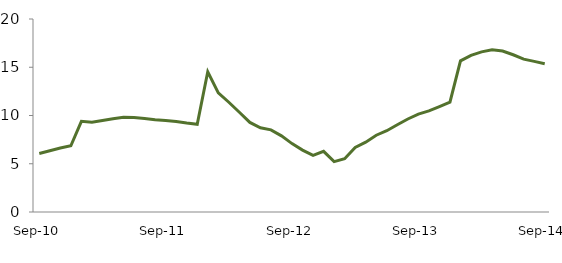
| Category | Series 0 |
|---|---|
| Sep-10 | 6.066 |
|  | 6.343 |
|  | 6.624 |
|  | 6.86 |
|  | 9.397 |
|  | 9.299 |
|  | 9.489 |
|  | 9.655 |
|  | 9.807 |
|  | 9.788 |
|  | 9.681 |
|  | 9.551 |
| Sep-11 | 9.482 |
|  | 9.372 |
|  | 9.217 |
|  | 9.093 |
|  | 14.528 |
|  | 12.349 |
|  | 11.373 |
|  | 10.337 |
|  | 9.286 |
|  | 8.73 |
|  | 8.508 |
|  | 7.893 |
| Sep-12 | 7.089 |
|  | 6.413 |
|  | 5.876 |
|  | 6.284 |
|  | 5.213 |
|  | 5.519 |
|  | 6.687 |
|  | 7.238 |
|  | 7.954 |
|  | 8.423 |
|  | 9.043 |
|  | 9.636 |
| Sep-13 | 10.148 |
|  | 10.484 |
|  | 10.93 |
|  | 11.389 |
|  | 15.665 |
|  | 16.236 |
|  | 16.597 |
|  | 16.81 |
|  | 16.684 |
|  | 16.293 |
|  | 15.842 |
|  | 15.61 |
| Sep-14 | 15.371 |